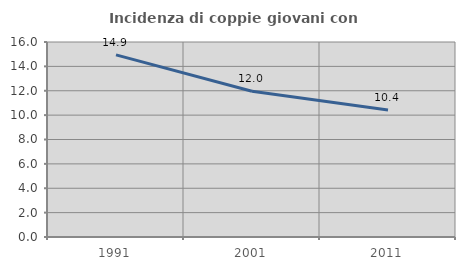
| Category | Incidenza di coppie giovani con figli |
|---|---|
| 1991.0 | 14.943 |
| 2001.0 | 11.957 |
| 2011.0 | 10.423 |